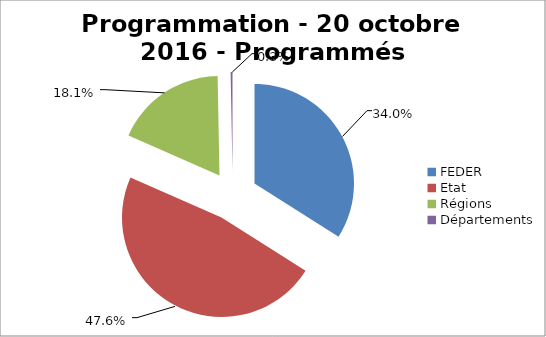
| Category | Series 0 |
|---|---|
| FEDER | 1660941.442 |
| Etat | 2328443.603 |
| Régions | 884464.24 |
| Départements | 14765 |